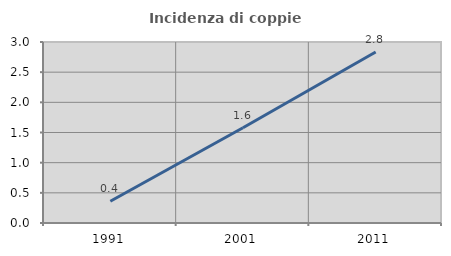
| Category | Incidenza di coppie miste |
|---|---|
| 1991.0 | 0.361 |
| 2001.0 | 1.578 |
| 2011.0 | 2.834 |